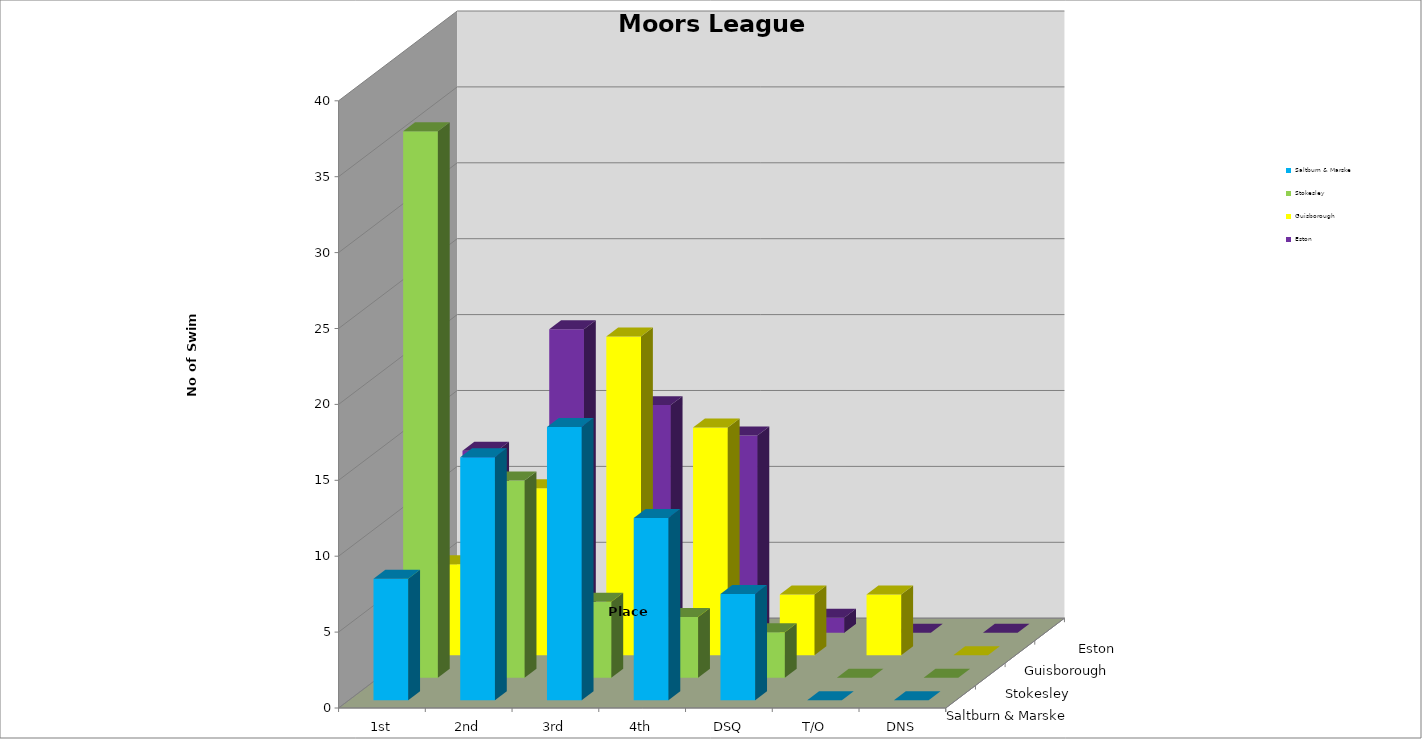
| Category | Saltburn & Marske | Stokesley | Guisborough | Eston |
|---|---|---|---|---|
| 1st | 8 | 36 | 6 | 12 |
| 2nd | 16 | 13 | 11 | 20 |
| 3rd | 18 | 5 | 21 | 15 |
| 4th | 12 | 4 | 15 | 13 |
| DSQ | 7 | 3 | 4 | 1 |
| T/O | 0 | 0 | 4 | 0 |
| DNS | 0 | 0 | 0 | 0 |